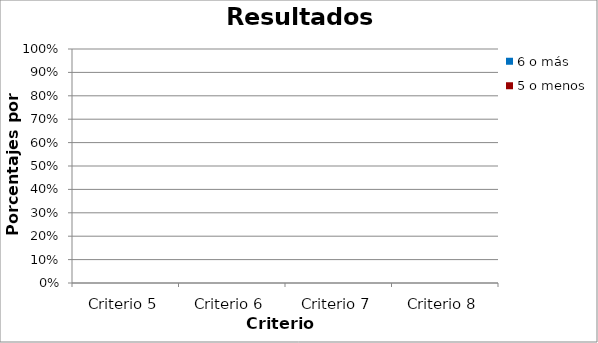
| Category | 6 o más | 5 o menos |
|---|---|---|
| Criterio 5 | 0 | 0 |
| Criterio 6 | 0 | 0 |
| Criterio 7 | 0 | 0 |
| Criterio 8 | 0 | 0 |